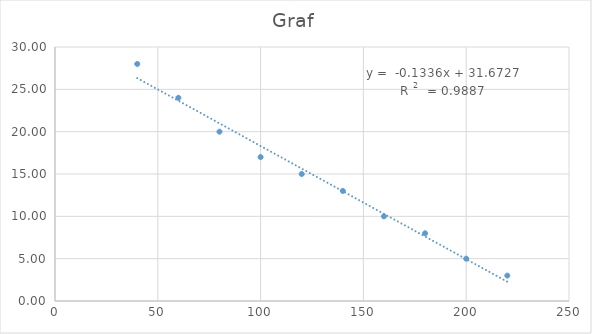
| Category | Poptávka |
|---|---|
| 40.0 | 28 |
| 60.0 | 24 |
| 80.0 | 20 |
| 100.0 | 17 |
| 120.0 | 15 |
| 140.0 | 13 |
| 160.0 | 10 |
| 180.0 | 8 |
| 200.0 | 5 |
| 220.0 | 3 |